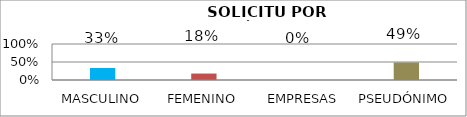
| Category | Series 1 |
|---|---|
| MASCULINO | 0.333 |
| FEMENINO | 0.179 |
| EMPRESAS | 0 |
| PSEUDÓNIMO | 0.487 |